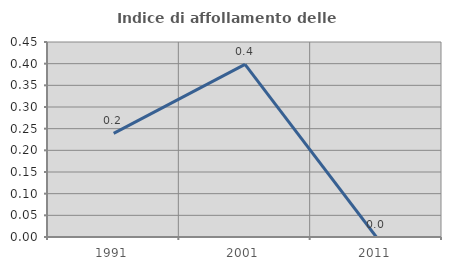
| Category | Indice di affollamento delle abitazioni  |
|---|---|
| 1991.0 | 0.239 |
| 2001.0 | 0.398 |
| 2011.0 | 0 |